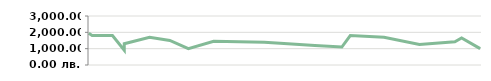
| Category | ПРИХОДИ |
|---|---|
| 2013-04-23 | 1950 |
| 2013-04-25 | 1800 |
| 2013-05-07 | 1800 |
| 2013-05-14 | 900 |
| 2013-05-14 | 1300 |
| 2013-05-29 | 1700 |
| 2013-06-10 | 1500 |
| 2013-06-21 | 1000 |
| 2013-07-06 | 1450 |
| 2013-08-05 | 1400 |
| 2013-08-19 | 1300 |
| 2013-09-04 | 1200 |
| 2013-09-20 | 1100 |
| 2013-09-25 | 1800 |
| 2013-10-15 | 1700 |
| 2013-11-05 | 1250 |
| 2013-11-26 | 1425 |
| 2013-11-30 | 1650 |
| 2013-12-11 | 1000 |